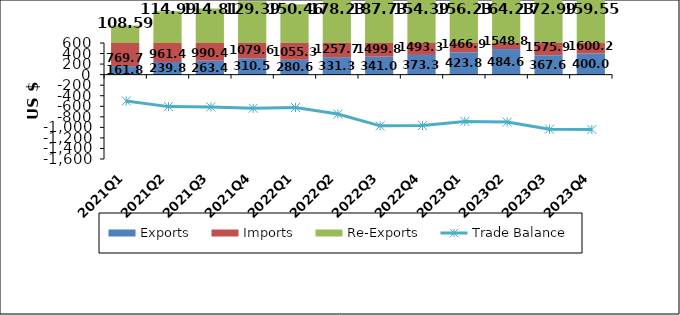
| Category | Exports | Imports | Re-Exports |
|---|---|---|---|
| 2021Q1 | 161.833 | 769.764 | 108.588 |
| 2021Q2 | 239.882 | 961.439 | 114.995 |
| 2021Q3 | 263.451 | 990.421 | 114.805 |
| 2021Q4 | 310.56 | 1079.656 | 129.387 |
| 2022Q1 | 280.673 | 1055.385 | 150.457 |
| 2022Q2 | 331.325 | 1257.717 | 178.235 |
| 2022Q3 | 341.036 | 1499.805 | 187.729 |
| 2022Q4 | 373.389 | 1493.34 | 154.392 |
| 2023Q1 | 423.886 | 1466.903 | 156.235 |
| 2023Q2 | 484.639 | 1548.799 | 164.233 |
| 2023Q3 | 367.611 | 1575.967 | 172.989 |
| 2023Q4 | 400.06 | 1600.241 | 159.554 |